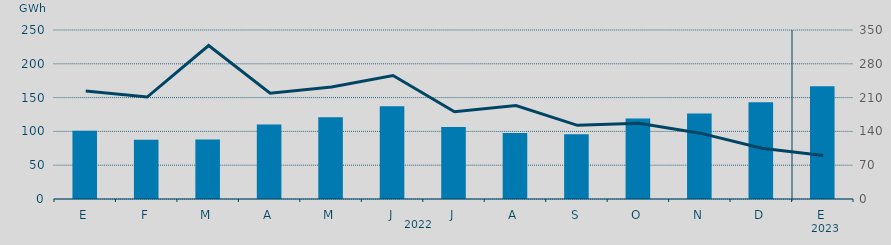
| Category | Energía a subir |
|---|---|
| E | 100.885 |
| F | 87.769 |
| M | 87.943 |
| A | 110.173 |
| M | 120.911 |
| J | 137.249 |
| J | 106.554 |
| A | 97.587 |
| S | 95.748 |
| O | 118.914 |
| N | 126.653 |
| D | 143.004 |
| E | 166.862 |